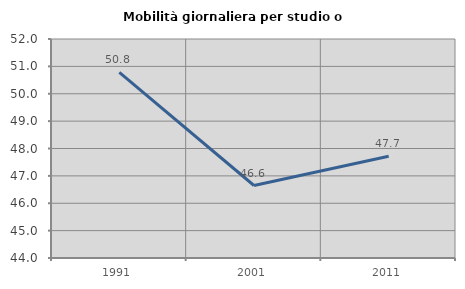
| Category | Mobilità giornaliera per studio o lavoro |
|---|---|
| 1991.0 | 50.78 |
| 2001.0 | 46.648 |
| 2011.0 | 47.717 |